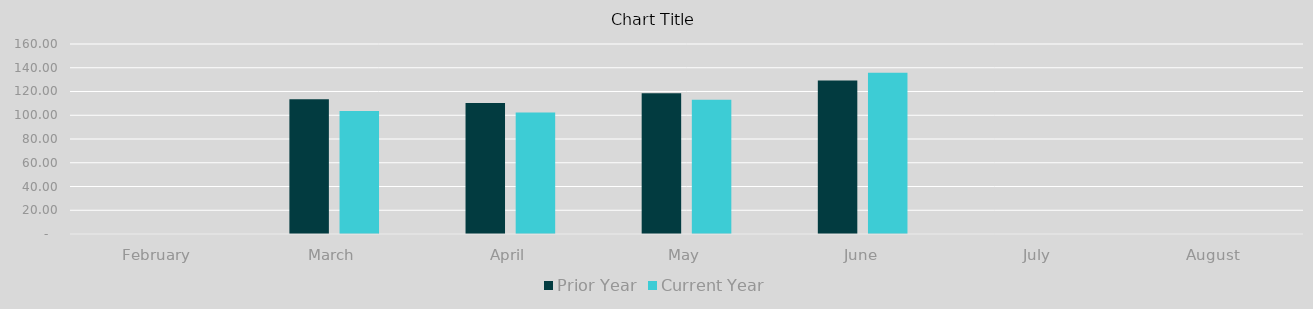
| Category | Prior Year | Current Year |
|---|---|---|
| February | 0 | 0 |
| March | 113.435 | 103.589 |
| April | 110.378 | 102.234 |
| May | 118.45 | 112.97 |
| June | 129.166 | 135.774 |
| July | 0 | 0 |
| August | 0 | 0 |